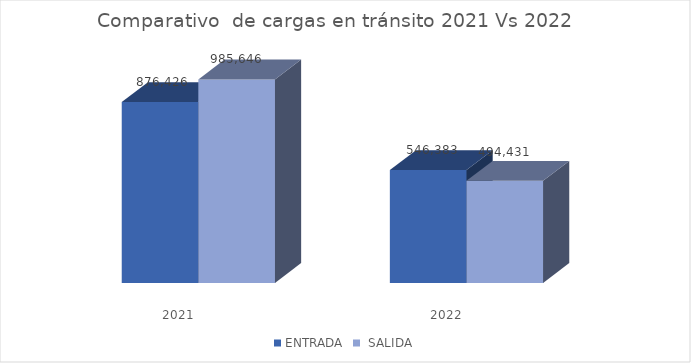
| Category | ENTRADA |  SALIDA |
|---|---|---|
| 2021.0 | 876426 | 985646 |
| 2022.0 | 546383 | 494431 |